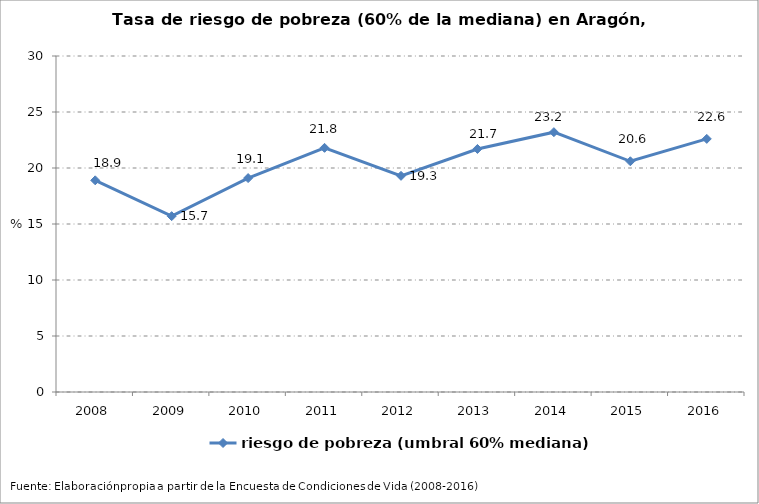
| Category | riesgo de pobreza (umbral 60% mediana) |
|---|---|
| 2008.0 | 18.9 |
| 2009.0 | 15.7 |
| 2010.0 | 19.1 |
| 2011.0 | 21.8 |
| 2012.0 | 19.3 |
| 2013.0 | 21.7 |
| 2014.0 | 23.2 |
| 2015.0 | 20.6 |
| 2016.0 | 22.6 |